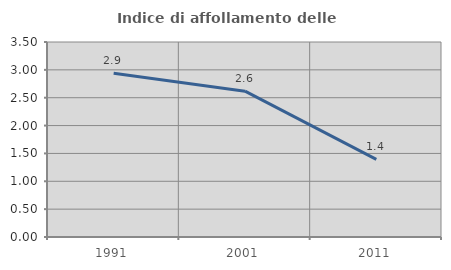
| Category | Indice di affollamento delle abitazioni  |
|---|---|
| 1991.0 | 2.938 |
| 2001.0 | 2.617 |
| 2011.0 | 1.393 |